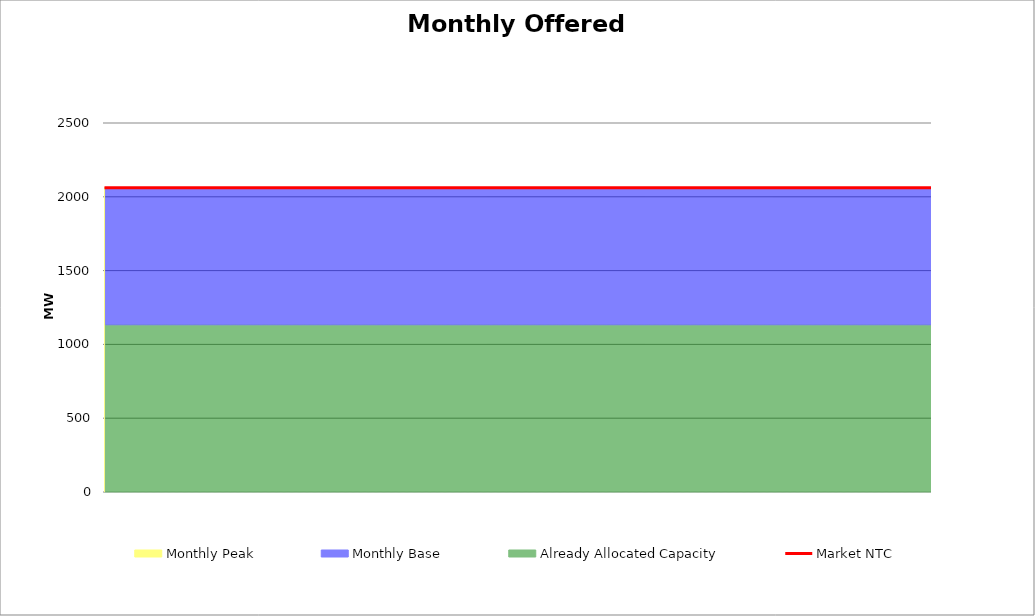
| Category | Market NTC |
|---|---|
| 0 | 2062 |
| 1 | 2062 |
| 2 | 2062 |
| 3 | 2062 |
| 4 | 2062 |
| 5 | 2062 |
| 6 | 2062 |
| 7 | 2061 |
| 8 | 2061 |
| 9 | 2061 |
| 10 | 2061 |
| 11 | 2061 |
| 12 | 2061 |
| 13 | 2061 |
| 14 | 2061 |
| 15 | 2061 |
| 16 | 2061 |
| 17 | 2061 |
| 18 | 2061 |
| 19 | 2061 |
| 20 | 2061 |
| 21 | 2061 |
| 22 | 2061 |
| 23 | 2062 |
| 24 | 2062 |
| 25 | 2062 |
| 26 | 2062 |
| 27 | 2062 |
| 28 | 2062 |
| 29 | 2062 |
| 30 | 2062 |
| 31 | 2061 |
| 32 | 2061 |
| 33 | 2061 |
| 34 | 2061 |
| 35 | 2061 |
| 36 | 2061 |
| 37 | 2061 |
| 38 | 2061 |
| 39 | 2061 |
| 40 | 2061 |
| 41 | 2061 |
| 42 | 2061 |
| 43 | 2061 |
| 44 | 2061 |
| 45 | 2061 |
| 46 | 2061 |
| 47 | 2062 |
| 48 | 2062 |
| 49 | 2062 |
| 50 | 2062 |
| 51 | 2062 |
| 52 | 2062 |
| 53 | 2062 |
| 54 | 2062 |
| 55 | 2061 |
| 56 | 2061 |
| 57 | 2061 |
| 58 | 2061 |
| 59 | 2061 |
| 60 | 2061 |
| 61 | 2061 |
| 62 | 2061 |
| 63 | 2061 |
| 64 | 2061 |
| 65 | 2061 |
| 66 | 2061 |
| 67 | 2061 |
| 68 | 2061 |
| 69 | 2061 |
| 70 | 2061 |
| 71 | 2062 |
| 72 | 2062 |
| 73 | 2062 |
| 74 | 2062 |
| 75 | 2062 |
| 76 | 2062 |
| 77 | 2062 |
| 78 | 2062 |
| 79 | 2062 |
| 80 | 2062 |
| 81 | 2062 |
| 82 | 2062 |
| 83 | 2062 |
| 84 | 2062 |
| 85 | 2062 |
| 86 | 2062 |
| 87 | 2062 |
| 88 | 2062 |
| 89 | 2062 |
| 90 | 2062 |
| 91 | 2062 |
| 92 | 2062 |
| 93 | 2062 |
| 94 | 2062 |
| 95 | 2062 |
| 96 | 2062 |
| 97 | 2062 |
| 98 | 2062 |
| 99 | 2062 |
| 100 | 2062 |
| 101 | 2062 |
| 102 | 2062 |
| 103 | 2061 |
| 104 | 2061 |
| 105 | 2061 |
| 106 | 2061 |
| 107 | 2061 |
| 108 | 2061 |
| 109 | 2061 |
| 110 | 2061 |
| 111 | 2061 |
| 112 | 2061 |
| 113 | 2061 |
| 114 | 2061 |
| 115 | 2061 |
| 116 | 2061 |
| 117 | 2061 |
| 118 | 2061 |
| 119 | 2062 |
| 120 | 2062 |
| 121 | 2062 |
| 122 | 2062 |
| 123 | 2062 |
| 124 | 2062 |
| 125 | 2062 |
| 126 | 2062 |
| 127 | 2061 |
| 128 | 2061 |
| 129 | 2061 |
| 130 | 2061 |
| 131 | 2061 |
| 132 | 2061 |
| 133 | 2061 |
| 134 | 2061 |
| 135 | 2061 |
| 136 | 2061 |
| 137 | 2061 |
| 138 | 2061 |
| 139 | 2061 |
| 140 | 2061 |
| 141 | 2061 |
| 142 | 2061 |
| 143 | 2062 |
| 144 | 2062 |
| 145 | 2062 |
| 146 | 2062 |
| 147 | 2062 |
| 148 | 2062 |
| 149 | 2062 |
| 150 | 2062 |
| 151 | 2061 |
| 152 | 2061 |
| 153 | 2061 |
| 154 | 2061 |
| 155 | 2061 |
| 156 | 2061 |
| 157 | 2061 |
| 158 | 2061 |
| 159 | 2061 |
| 160 | 2061 |
| 161 | 2061 |
| 162 | 2061 |
| 163 | 2061 |
| 164 | 2061 |
| 165 | 2061 |
| 166 | 2061 |
| 167 | 2062 |
| 168 | 2062 |
| 169 | 2062 |
| 170 | 2062 |
| 171 | 2062 |
| 172 | 2062 |
| 173 | 2062 |
| 174 | 2062 |
| 175 | 2061 |
| 176 | 2061 |
| 177 | 2061 |
| 178 | 2061 |
| 179 | 2061 |
| 180 | 2061 |
| 181 | 2061 |
| 182 | 2061 |
| 183 | 2061 |
| 184 | 2061 |
| 185 | 2061 |
| 186 | 2061 |
| 187 | 2061 |
| 188 | 2061 |
| 189 | 2061 |
| 190 | 2061 |
| 191 | 2062 |
| 192 | 2062 |
| 193 | 2062 |
| 194 | 2062 |
| 195 | 2062 |
| 196 | 2062 |
| 197 | 2062 |
| 198 | 2062 |
| 199 | 2061 |
| 200 | 2061 |
| 201 | 2061 |
| 202 | 2061 |
| 203 | 2061 |
| 204 | 2061 |
| 205 | 2061 |
| 206 | 2061 |
| 207 | 2061 |
| 208 | 2061 |
| 209 | 2061 |
| 210 | 2061 |
| 211 | 2061 |
| 212 | 2061 |
| 213 | 2061 |
| 214 | 2061 |
| 215 | 2062 |
| 216 | 2062 |
| 217 | 2062 |
| 218 | 2062 |
| 219 | 2062 |
| 220 | 2062 |
| 221 | 2062 |
| 222 | 2062 |
| 223 | 2061 |
| 224 | 2061 |
| 225 | 2061 |
| 226 | 2061 |
| 227 | 2061 |
| 228 | 2061 |
| 229 | 2061 |
| 230 | 2061 |
| 231 | 2061 |
| 232 | 2061 |
| 233 | 2061 |
| 234 | 2061 |
| 235 | 2061 |
| 236 | 2061 |
| 237 | 2061 |
| 238 | 2061 |
| 239 | 2062 |
| 240 | 2062 |
| 241 | 2062 |
| 242 | 2062 |
| 243 | 2062 |
| 244 | 2062 |
| 245 | 2062 |
| 246 | 2062 |
| 247 | 2062 |
| 248 | 2062 |
| 249 | 2062 |
| 250 | 2062 |
| 251 | 2062 |
| 252 | 2062 |
| 253 | 2062 |
| 254 | 2062 |
| 255 | 2062 |
| 256 | 2062 |
| 257 | 2062 |
| 258 | 2062 |
| 259 | 2062 |
| 260 | 2062 |
| 261 | 2062 |
| 262 | 2062 |
| 263 | 2062 |
| 264 | 2062 |
| 265 | 2062 |
| 266 | 2062 |
| 267 | 2062 |
| 268 | 2062 |
| 269 | 2062 |
| 270 | 2062 |
| 271 | 2061 |
| 272 | 2061 |
| 273 | 2061 |
| 274 | 2061 |
| 275 | 2061 |
| 276 | 2061 |
| 277 | 2061 |
| 278 | 2061 |
| 279 | 2061 |
| 280 | 2061 |
| 281 | 2061 |
| 282 | 2061 |
| 283 | 2061 |
| 284 | 2061 |
| 285 | 2061 |
| 286 | 2061 |
| 287 | 2062 |
| 288 | 2062 |
| 289 | 2062 |
| 290 | 2062 |
| 291 | 2062 |
| 292 | 2062 |
| 293 | 2062 |
| 294 | 2062 |
| 295 | 2061 |
| 296 | 2061 |
| 297 | 2061 |
| 298 | 2061 |
| 299 | 2061 |
| 300 | 2061 |
| 301 | 2061 |
| 302 | 2061 |
| 303 | 2061 |
| 304 | 2061 |
| 305 | 2061 |
| 306 | 2061 |
| 307 | 2061 |
| 308 | 2061 |
| 309 | 2061 |
| 310 | 2061 |
| 311 | 2062 |
| 312 | 2062 |
| 313 | 2062 |
| 314 | 2062 |
| 315 | 2062 |
| 316 | 2062 |
| 317 | 2062 |
| 318 | 2062 |
| 319 | 2061 |
| 320 | 2061 |
| 321 | 2061 |
| 322 | 2061 |
| 323 | 2061 |
| 324 | 2061 |
| 325 | 2061 |
| 326 | 2061 |
| 327 | 2061 |
| 328 | 2061 |
| 329 | 2061 |
| 330 | 2061 |
| 331 | 2061 |
| 332 | 2061 |
| 333 | 2061 |
| 334 | 2061 |
| 335 | 2062 |
| 336 | 2062 |
| 337 | 2062 |
| 338 | 2062 |
| 339 | 2062 |
| 340 | 2062 |
| 341 | 2062 |
| 342 | 2062 |
| 343 | 2061 |
| 344 | 2061 |
| 345 | 2061 |
| 346 | 2061 |
| 347 | 2061 |
| 348 | 2061 |
| 349 | 2061 |
| 350 | 2061 |
| 351 | 2061 |
| 352 | 2061 |
| 353 | 2061 |
| 354 | 2061 |
| 355 | 2061 |
| 356 | 2061 |
| 357 | 2061 |
| 358 | 2061 |
| 359 | 2062 |
| 360 | 2062 |
| 361 | 2062 |
| 362 | 2062 |
| 363 | 2062 |
| 364 | 2062 |
| 365 | 2062 |
| 366 | 2062 |
| 367 | 2061 |
| 368 | 2061 |
| 369 | 2061 |
| 370 | 2061 |
| 371 | 2061 |
| 372 | 2061 |
| 373 | 2061 |
| 374 | 2061 |
| 375 | 2061 |
| 376 | 2061 |
| 377 | 2061 |
| 378 | 2061 |
| 379 | 2061 |
| 380 | 2061 |
| 381 | 2061 |
| 382 | 2061 |
| 383 | 2062 |
| 384 | 2062 |
| 385 | 2062 |
| 386 | 2062 |
| 387 | 2062 |
| 388 | 2062 |
| 389 | 2062 |
| 390 | 2062 |
| 391 | 2061 |
| 392 | 2061 |
| 393 | 2061 |
| 394 | 2061 |
| 395 | 2061 |
| 396 | 2061 |
| 397 | 2061 |
| 398 | 2061 |
| 399 | 2061 |
| 400 | 2061 |
| 401 | 2061 |
| 402 | 2061 |
| 403 | 2061 |
| 404 | 2061 |
| 405 | 2061 |
| 406 | 2061 |
| 407 | 2062 |
| 408 | 2062 |
| 409 | 2062 |
| 410 | 2062 |
| 411 | 2062 |
| 412 | 2062 |
| 413 | 2062 |
| 414 | 2062 |
| 415 | 2062 |
| 416 | 2062 |
| 417 | 2062 |
| 418 | 2062 |
| 419 | 2062 |
| 420 | 2062 |
| 421 | 2062 |
| 422 | 2062 |
| 423 | 2062 |
| 424 | 2062 |
| 425 | 2062 |
| 426 | 2062 |
| 427 | 2062 |
| 428 | 2062 |
| 429 | 2062 |
| 430 | 2062 |
| 431 | 2062 |
| 432 | 2062 |
| 433 | 2062 |
| 434 | 2062 |
| 435 | 2062 |
| 436 | 2062 |
| 437 | 2062 |
| 438 | 2062 |
| 439 | 2061 |
| 440 | 2061 |
| 441 | 2061 |
| 442 | 2061 |
| 443 | 2061 |
| 444 | 2061 |
| 445 | 2061 |
| 446 | 2061 |
| 447 | 2061 |
| 448 | 2061 |
| 449 | 2061 |
| 450 | 2061 |
| 451 | 2061 |
| 452 | 2061 |
| 453 | 2061 |
| 454 | 2061 |
| 455 | 2062 |
| 456 | 2062 |
| 457 | 2062 |
| 458 | 2062 |
| 459 | 2062 |
| 460 | 2062 |
| 461 | 2062 |
| 462 | 2062 |
| 463 | 2061 |
| 464 | 2061 |
| 465 | 2061 |
| 466 | 2061 |
| 467 | 2061 |
| 468 | 2061 |
| 469 | 2061 |
| 470 | 2061 |
| 471 | 2061 |
| 472 | 2061 |
| 473 | 2061 |
| 474 | 2061 |
| 475 | 2061 |
| 476 | 2061 |
| 477 | 2061 |
| 478 | 2061 |
| 479 | 2062 |
| 480 | 2062 |
| 481 | 2062 |
| 482 | 2062 |
| 483 | 2062 |
| 484 | 2062 |
| 485 | 2062 |
| 486 | 2062 |
| 487 | 2061 |
| 488 | 2061 |
| 489 | 2061 |
| 490 | 2061 |
| 491 | 2061 |
| 492 | 2061 |
| 493 | 2061 |
| 494 | 2061 |
| 495 | 2061 |
| 496 | 2061 |
| 497 | 2061 |
| 498 | 2061 |
| 499 | 2061 |
| 500 | 2061 |
| 501 | 2061 |
| 502 | 2061 |
| 503 | 2062 |
| 504 | 2062 |
| 505 | 2062 |
| 506 | 2062 |
| 507 | 2062 |
| 508 | 2062 |
| 509 | 2062 |
| 510 | 2062 |
| 511 | 2061 |
| 512 | 2061 |
| 513 | 2061 |
| 514 | 2061 |
| 515 | 2061 |
| 516 | 2061 |
| 517 | 2061 |
| 518 | 2061 |
| 519 | 2061 |
| 520 | 2061 |
| 521 | 2061 |
| 522 | 2061 |
| 523 | 2061 |
| 524 | 2061 |
| 525 | 2061 |
| 526 | 2061 |
| 527 | 2062 |
| 528 | 2062 |
| 529 | 2062 |
| 530 | 2062 |
| 531 | 2062 |
| 532 | 2062 |
| 533 | 2062 |
| 534 | 2062 |
| 535 | 2061 |
| 536 | 2061 |
| 537 | 2061 |
| 538 | 2061 |
| 539 | 2061 |
| 540 | 2061 |
| 541 | 2061 |
| 542 | 2061 |
| 543 | 2061 |
| 544 | 2061 |
| 545 | 2061 |
| 546 | 2061 |
| 547 | 2061 |
| 548 | 2061 |
| 549 | 2061 |
| 550 | 2061 |
| 551 | 2062 |
| 552 | 2062 |
| 553 | 2062 |
| 554 | 2062 |
| 555 | 2062 |
| 556 | 2062 |
| 557 | 2062 |
| 558 | 2062 |
| 559 | 2061 |
| 560 | 2061 |
| 561 | 2061 |
| 562 | 2061 |
| 563 | 2061 |
| 564 | 2061 |
| 565 | 2061 |
| 566 | 2061 |
| 567 | 2061 |
| 568 | 2061 |
| 569 | 2061 |
| 570 | 2061 |
| 571 | 2061 |
| 572 | 2061 |
| 573 | 2061 |
| 574 | 2061 |
| 575 | 2062 |
| 576 | 2062 |
| 577 | 2062 |
| 578 | 2062 |
| 579 | 2062 |
| 580 | 2062 |
| 581 | 2062 |
| 582 | 2062 |
| 583 | 2062 |
| 584 | 2062 |
| 585 | 2062 |
| 586 | 2062 |
| 587 | 2062 |
| 588 | 2062 |
| 589 | 2062 |
| 590 | 2062 |
| 591 | 2062 |
| 592 | 2062 |
| 593 | 2062 |
| 594 | 2062 |
| 595 | 2062 |
| 596 | 2062 |
| 597 | 2062 |
| 598 | 2062 |
| 599 | 2062 |
| 600 | 2062 |
| 601 | 2062 |
| 602 | 2062 |
| 603 | 2062 |
| 604 | 2062 |
| 605 | 2062 |
| 606 | 2062 |
| 607 | 2061 |
| 608 | 2061 |
| 609 | 2061 |
| 610 | 2061 |
| 611 | 2061 |
| 612 | 2061 |
| 613 | 2061 |
| 614 | 2061 |
| 615 | 2061 |
| 616 | 2061 |
| 617 | 2061 |
| 618 | 2061 |
| 619 | 2061 |
| 620 | 2061 |
| 621 | 2061 |
| 622 | 2061 |
| 623 | 2062 |
| 624 | 2062 |
| 625 | 2062 |
| 626 | 2062 |
| 627 | 2062 |
| 628 | 2062 |
| 629 | 2062 |
| 630 | 2062 |
| 631 | 2061 |
| 632 | 2061 |
| 633 | 2061 |
| 634 | 2061 |
| 635 | 2061 |
| 636 | 2061 |
| 637 | 2061 |
| 638 | 2061 |
| 639 | 2061 |
| 640 | 2061 |
| 641 | 2061 |
| 642 | 2061 |
| 643 | 2061 |
| 644 | 2061 |
| 645 | 2061 |
| 646 | 2061 |
| 647 | 2062 |
| 648 | 2062 |
| 649 | 2062 |
| 650 | 2062 |
| 651 | 2062 |
| 652 | 2062 |
| 653 | 2062 |
| 654 | 2062 |
| 655 | 2061 |
| 656 | 2061 |
| 657 | 2061 |
| 658 | 2061 |
| 659 | 2061 |
| 660 | 2061 |
| 661 | 2061 |
| 662 | 2061 |
| 663 | 2061 |
| 664 | 2061 |
| 665 | 2061 |
| 666 | 2061 |
| 667 | 2061 |
| 668 | 2061 |
| 669 | 2061 |
| 670 | 2061 |
| 671 | 2062 |
| 672 | 2062 |
| 673 | 2062 |
| 674 | 2062 |
| 675 | 2062 |
| 676 | 2062 |
| 677 | 2062 |
| 678 | 2062 |
| 679 | 2061 |
| 680 | 2061 |
| 681 | 2061 |
| 682 | 2061 |
| 683 | 2061 |
| 684 | 2061 |
| 685 | 2061 |
| 686 | 2061 |
| 687 | 2061 |
| 688 | 2061 |
| 689 | 2061 |
| 690 | 2061 |
| 691 | 2061 |
| 692 | 2061 |
| 693 | 2061 |
| 694 | 2061 |
| 695 | 2062 |
| 696 | 2062 |
| 697 | 2062 |
| 698 | 2062 |
| 699 | 2062 |
| 700 | 2062 |
| 701 | 2062 |
| 702 | 2062 |
| 703 | 2061 |
| 704 | 2061 |
| 705 | 2061 |
| 706 | 2061 |
| 707 | 2061 |
| 708 | 2061 |
| 709 | 2061 |
| 710 | 2061 |
| 711 | 2061 |
| 712 | 2061 |
| 713 | 2061 |
| 714 | 2061 |
| 715 | 2061 |
| 716 | 2061 |
| 717 | 2061 |
| 718 | 2061 |
| 719 | 2062 |